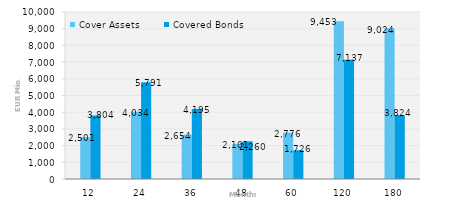
| Category | Cover Assets | Covered Bonds |
|---|---|---|
| 12.0 | 2501.3 | 3804.3 |
| 24.0 | 4034 | 5790.6 |
| 36.0 | 2654.1 | 4194.9 |
| 48.0 | 2100.5 | 2260.3 |
| 60.0 | 2775.9 | 1725.5 |
| 120.0 | 9453.3 | 7136.9 |
| 180.0 | 9023.5 | 3824.3 |